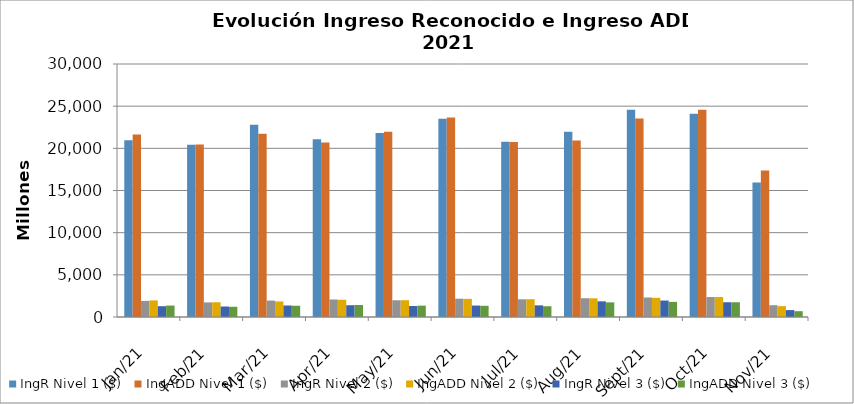
| Category | IngR Nivel 1 ($) | IngADD Nivel 1 ($) | IngR Nivel 2 ($) | IngADD Nivel 2 ($) | IngR Nivel 3 ($) | IngADD Nivel 3 ($) |
|---|---|---|---|---|---|---|
| 2021-01-01 | 20967654613 | 21648333169 | 1911145388 | 1965707379 | 1279118209 | 1358074859 |
| 2021-02-01 | 20415862558 | 20457462879 | 1730301527 | 1746391697 | 1242107356 | 1212366390 |
| 2021-03-01 | 22795641037 | 21718555748 | 1947099711 | 1846606947 | 1363953363 | 1335909968 |
| 2021-04-01 | 21064046845 | 20688286168 | 2074256580 | 2037190289 | 1395996735 | 1426609475 |
| 2021-05-01 | 21814769340 | 21967907103 | 1987305516 | 1991888183 | 1305520430 | 1345455728 |
| 2021-06-01 | 23504777264 | 23667795323 | 2167841986 | 2150266405 | 1358496058 | 1325921502 |
| 2021-07-01 | 20770350635 | 20752612959 | 2101077910 | 2114832697 | 1380989270 | 1279059163 |
| 2021-08-01 | 21959229433 | 20921674480 | 2227516494 | 2213212544 | 1857990299 | 1733864877 |
| 2021-09-01 | 24573875291 | 23546178325 | 2314213150 | 2272585253 | 1950189341 | 1791931653 |
| 2021-10-01 | 24100438847 | 24563105612 | 2365907677 | 2364729510 | 1748613387 | 1747247503 |
| 2021-11-01 | 15942269412 | 17369696118 | 1397391174 | 1286762451 | 818819777 | 690368140 |